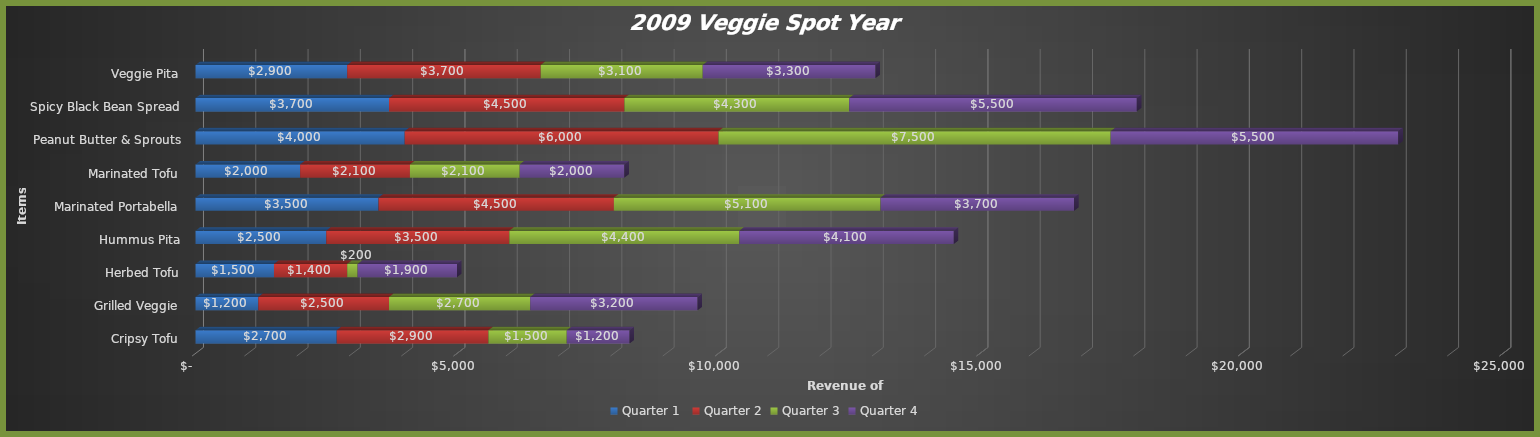
| Category | Quarter 1  | Quarter 2 | Quarter 3 | Quarter 4 |
|---|---|---|---|---|
| Cripsy Tofu | 2700 | 2900 | 1500 | 1200 |
| Grilled Veggie | 1200 | 2500 | 2700 | 3200 |
| Herbed Tofu | 1500 | 1400 | 200 | 1900 |
| Hummus Pita | 2500 | 3500 | 4400 | 4100 |
| Marinated Portabella | 3500 | 4500 | 5100 | 3700 |
| Marinated Tofu | 2000 | 2100 | 2100 | 2000 |
| Peanut Butter & Sprouts | 4000 | 6000 | 7500 | 5500 |
| Spicy Black Bean Spread | 3700 | 4500 | 4300 | 5500 |
| Veggie Pita | 2900 | 3700 | 3100 | 3300 |